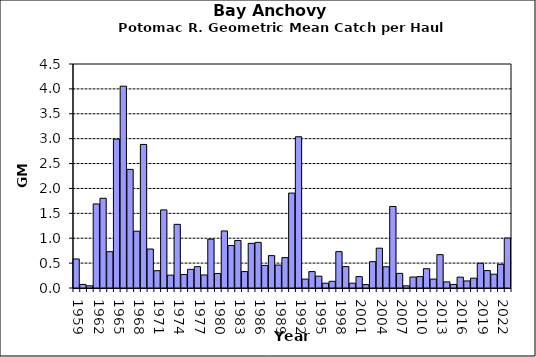
| Category | Series 0 |
|---|---|
| 1959.0 | 0.583 |
| 1960.0 | 0.072 |
| 1961.0 | 0.044 |
| 1962.0 | 1.689 |
| 1963.0 | 1.802 |
| 1964.0 | 0.73 |
| 1965.0 | 2.991 |
| 1966.0 | 4.054 |
| 1967.0 | 2.383 |
| 1968.0 | 1.141 |
| 1969.0 | 2.884 |
| 1970.0 | 0.783 |
| 1971.0 | 0.347 |
| 1972.0 | 1.569 |
| 1973.0 | 0.258 |
| 1974.0 | 1.279 |
| 1975.0 | 0.27 |
| 1976.0 | 0.375 |
| 1977.0 | 0.428 |
| 1978.0 | 0.262 |
| 1979.0 | 0.982 |
| 1980.0 | 0.291 |
| 1981.0 | 1.146 |
| 1982.0 | 0.853 |
| 1983.0 | 0.955 |
| 1984.0 | 0.33 |
| 1985.0 | 0.896 |
| 1986.0 | 0.917 |
| 1987.0 | 0.454 |
| 1988.0 | 0.651 |
| 1989.0 | 0.461 |
| 1990.0 | 0.61 |
| 1991.0 | 1.907 |
| 1992.0 | 3.038 |
| 1993.0 | 0.178 |
| 1994.0 | 0.33 |
| 1995.0 | 0.237 |
| 1996.0 | 0.097 |
| 1997.0 | 0.134 |
| 1998.0 | 0.731 |
| 1999.0 | 0.43 |
| 2000.0 | 0.097 |
| 2001.0 | 0.229 |
| 2002.0 | 0.068 |
| 2003.0 | 0.529 |
| 2004.0 | 0.8 |
| 2005.0 | 0.427 |
| 2006.0 | 1.638 |
| 2007.0 | 0.294 |
| 2008.0 | 0.044 |
| 2009.0 | 0.221 |
| 2010.0 | 0.228 |
| 2011.0 | 0.387 |
| 2012.0 | 0.179 |
| 2013.0 | 0.67 |
| 2014.0 | 0.122 |
| 2015.0 | 0.071 |
| 2016.0 | 0.218 |
| 2017.0 | 0.142 |
| 2018.0 | 0.197 |
| 2019.0 | 0.497 |
| 2020.0 | 0.35 |
| 2021.0 | 0.277 |
| 2022.0 | 0.476 |
| 2023.0 | 1.004 |